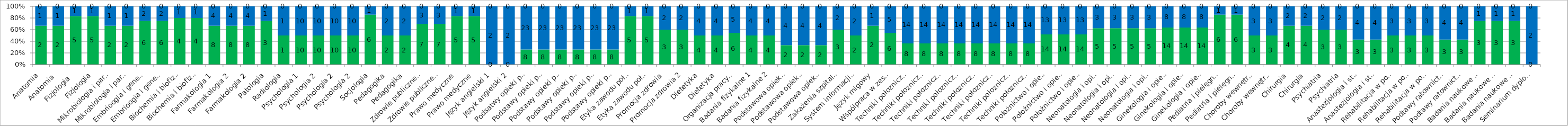
| Category | Wiedza | Umiejętności | Kompetencje społeczne |
|---|---|---|---|
| Anatomia | 2 | 1 | 0 |
| Anatomia   | 2 | 1 | 0 |
| Fizjologia   | 5 | 1 | 0 |
| Fizjologia | 5 | 1 | 0 |
| Mikrobiologia i parazytologia | 2 | 1 | 0 |
| Mikrobiologia i parazytologia | 2 | 1 | 0 |
| Embrioogia i genetyka | 6 | 2 | 0 |
| Embrioogia i genetyka | 6 | 2 | 0 |
| Biochemia i biofizyka | 4 | 1 | 0 |
| Biochemia i biofizyka | 4 | 1 | 0 |
| Farmakologia 1 | 8 | 4 | 0 |
| Farmakologia 2 | 8 | 4 | 0 |
| Farmakologia 2 | 8 | 4 | 0 |
| Patologia | 3 | 1 | 0 |
| Radiologia | 1 | 1 | 0 |
| Psychologia 1 | 10 | 10 | 0 |
| Psychologia 2 | 10 | 10 | 0 |
| Psychologia 2 | 10 | 10 | 0 |
| Psychologia 2 | 10 | 10 | 0 |
| Socjologia | 6 | 1 | 0 |
| Pedagogika | 2 | 2 | 0 |
| Pedagogika | 2 | 2 | 0 |
| Zdrowie publiczne 1 | 7 | 3 | 0 |
| Zdrowie publiczne 2 | 7 | 3 | 0 |
| Prawo medyczne | 5 | 1 | 0 |
| Prawo medyczne | 5 | 1 | 0 |
| Język angielski 1 | 0 | 2 | 0 |
| Język angielski 2 | 0 | 2 | 0 |
| Podsatwy opieki położniczej 1 | 8 | 23 | 0 |
| Podstawy opieki połozniczej 1 | 8 | 23 | 0 |
| Podstawy opieki połozniczej 1 | 8 | 23 | 0 |
| Podstawy opieki połozniczej 2 | 8 | 23 | 0 |
| Podstawy opieki połozniczej 2 | 8 | 23 | 0 |
| Podstawy opieki połozniczej 2 | 8 | 23 | 0 |
| Etyka zawodu położnej | 5 | 1 | 0 |
| Etyka zawodu położnej | 5 | 1 | 0 |
| Promocja zdrowia | 3 | 2 | 0 |
| Promocja zdrowia 2 | 3 | 2 | 0 |
| Dietetyka | 4 | 4 | 0 |
| Dietetyka | 4 | 4 | 0 |
| Organizacja pracy położnej | 6 | 5 | 0 |
| Badania fizykalne 1 | 4 | 4 | 0 |
| Badania fizykalne 2 | 4 | 4 | 0 |
| Podstawowa opieka zdrowotna | 2 | 4 | 0 |
| Podstawowa opieka zdrowotna | 2 | 4 | 0 |
| Podstawowa opieka zdrowotna | 2 | 4 | 0 |
| Zakażenia szpitalne | 3 | 2 | 0 |
| System informacji w ochronie zdrowia | 2 | 2 | 0 |
| Język migowy | 2 | 1 | 0 |
| Współpraca w zespołach opieki zdrowotnej | 6 | 5 | 0 |
| Techniki połoznicze i prowadzenie porodu 1 | 8 | 14 | 0 |
| Techniki połoznicze i prowadzenie porodu 1 | 8 | 14 | 0 |
| Techniki połoznicze i prowadzenie porodu 1 | 8 | 14 | 0 |
| Techniki połoznicze i prowadzenie porodu 2 | 8 | 14 | 0 |
| Techniki połoznicze i prowadzenie porodu 2 | 8 | 14 | 0 |
| Techniki połoznicze i prowadzenie porodu 2 | 8 | 14 | 0 |
| Techniki połoznicze i prowadzenie porodu 3 | 8 | 14 | 0 |
| Techniki połoznicze i prowadzenie porodu 3 | 8 | 14 | 0 |
| Położnictwo i opieka położnicza 1 | 14 | 13 | 0 |
| Położnictwo i opieka położnicza 2 | 14 | 13 | 0 |
| Położnictwo i opieka położnicza 2 | 14 | 13 | 0 |
| Neonatologia i opieka neonatologiczna 1 | 5 | 3 | 0 |
| Neonatologia i opieka neonatologiczna 1 | 5 | 3 | 0 |
| Neonatologia i opieka neonatologiczna 2 | 5 | 3 | 0 |
| Neonatologia i opieka neonatologiczna 2 | 5 | 3 | 0 |
| Ginekologia i opieka ginekologiczna 1 | 14 | 8 | 0 |
| Ginekologia i opieka ginekologiczna 2 | 14 | 8 | 0 |
| Ginekologia i opieka ginekologiczna 2 | 14 | 8 | 0 |
| Pediatria i pielęgniarstwo pediatryczne | 6 | 1 | 0 |
| Pediatria i pielęgniarstwo pediatryczne 2 | 6 | 1 | 0 |
| Choroby wewnętrzne | 3 | 3 | 0 |
| Choroby wewnętrzne  | 3 | 3 | 0 |
| Chirurgia | 4 | 2 | 0 |
| Chirurgia | 4 | 2 | 0 |
| Psychiatria | 3 | 2 | 0 |
| Psychiatria | 3 | 2 | 0 |
| Anastezjologia i stany zagrożenia zycia | 3 | 4 | 0 |
| Anastezjologia i stany zagrożenia zycia | 3 | 4 | 0 |
| Rehabilitacja w położnictwie, neonatologii i ginekologii | 3 | 3 | 0 |
| Rehabilitacja w położnictwie, neonatologii i ginekologii | 3 | 3 | 0 |
| Rehabilitacja w położnictwie, neonatologii i ginekologii | 3 | 3 | 0 |
| Podtawy ratownictwa medycznego | 3 | 4 | 0 |
| Podtawy ratownictwa medycznego | 3 | 4 | 0 |
| Badania naukowe w położnictwie 1 | 3 | 1 | 0 |
| Badania naukowe w położnictwie 1 | 3 | 1 | 0 |
| Badania naukowe w położnictwie 2 | 3 | 1 | 0 |
| Seminarium dyplomowe | 0 | 2 | 0 |